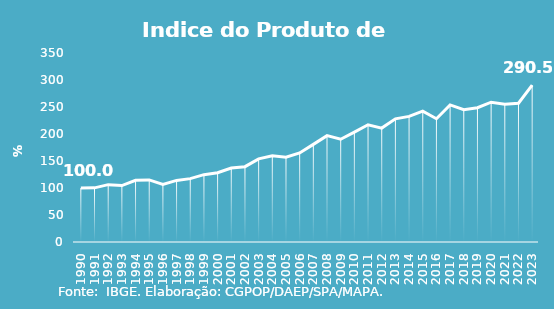
| Category | Indice de Prod. base 1990 |
|---|---|
| 1990.0 | 100 |
| 1991.0 | 100.275 |
| 1992.0 | 106.203 |
| 1993.0 | 104.57 |
| 1994.0 | 114.164 |
| 1995.0 | 115.024 |
| 1996.0 | 106.552 |
| 1997.0 | 114.037 |
| 1998.0 | 117.319 |
| 1999.0 | 124.734 |
| 2000.0 | 128.293 |
| 2001.0 | 136.975 |
| 2002.0 | 139.51 |
| 2003.0 | 153.868 |
| 2004.0 | 159.641 |
| 2005.0 | 157.136 |
| 2006.0 | 164.858 |
| 2007.0 | 180.781 |
| 2008.0 | 196.91 |
| 2009.0 | 190.309 |
| 2010.0 | 203.581 |
| 2011.0 | 217.041 |
| 2012.0 | 210.932 |
| 2013.0 | 228.009 |
| 2014.0 | 232.562 |
| 2015.0 | 242.318 |
| 2016.0 | 228.239 |
| 2017.0 | 253.826 |
| 2018.0 | 245.134 |
| 2019.0 | 248.619 |
| 2020.0 | 258.848 |
| 2021.0 | 254.988 |
| 2022.0 | 256.904 |
| 2023.0 | 290.498 |